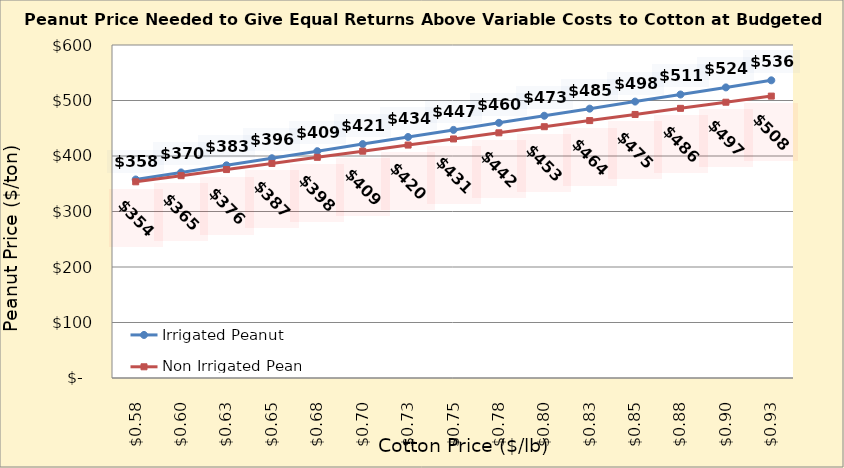
| Category | Irrigated Peanut | Non Irrigated Peanut |
|---|---|---|
| 0.5749999999999998 | 357.634 | 353.517 |
| 0.5999999999999999 | 370.4 | 364.547 |
| 0.6249999999999999 | 383.166 | 375.576 |
| 0.6499999999999999 | 395.932 | 386.605 |
| 0.6749999999999999 | 408.698 | 397.635 |
| 0.7 | 421.463 | 408.664 |
| 0.725 | 434.229 | 419.694 |
| 0.75 | 446.995 | 430.723 |
| 0.775 | 459.761 | 441.753 |
| 0.8 | 472.527 | 452.782 |
| 0.8250000000000001 | 485.293 | 463.811 |
| 0.8500000000000001 | 498.059 | 474.841 |
| 0.8750000000000001 | 510.825 | 485.87 |
| 0.9000000000000001 | 523.591 | 496.9 |
| 0.9250000000000002 | 536.357 | 507.929 |